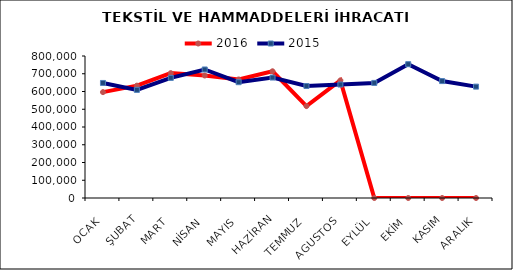
| Category | 2016 | 2015 |
|---|---|---|
| OCAK | 596410.316 | 648202.186 |
| ŞUBAT | 632935.492 | 609091.593 |
| MART | 703554.539 | 676704.106 |
| NİSAN | 690201.714 | 724073.651 |
| MAYIS | 667853.911 | 652378.05 |
| HAZİRAN | 713956.967 | 678623.233 |
| TEMMUZ | 517766.873 | 630930.68 |
| AGUSTOS | 662479.078 | 639215.103 |
| EYLÜL | 0 | 648365.971 |
| EKİM | 0 | 753918.72 |
| KASIM | 0 | 658650.304 |
| ARALIK | 0 | 627409.898 |